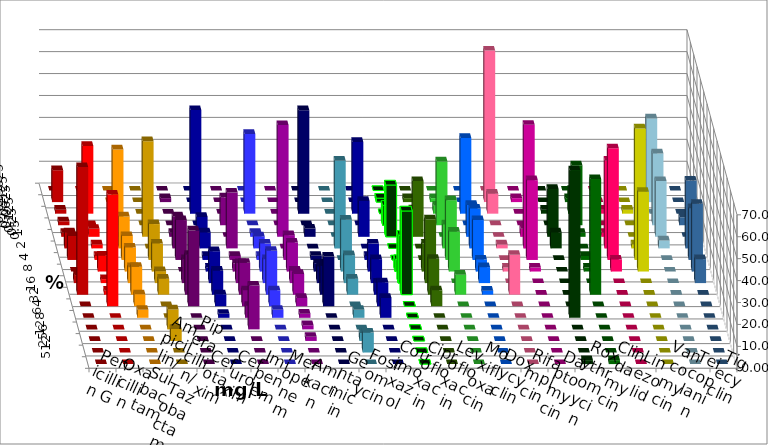
| Category | Penicillin G | Oxacillin | Ampicillin/ Sulbactam | Piperacillin/ Tazobactam | Cefotaxim | Cefuroxim | Imipenem | Meropenem | Amikacin | Gentamicin | Fosfomycin | Cotrimoxazol | Ciprofloxacin | Levofloxacin | Moxifloxacin | Doxycyclin | Rifampicin | Daptomycin | Roxythromycin | Clindamycin | Linezolid | Vancomycin | Teicoplanin | Tigecyclin |
|---|---|---|---|---|---|---|---|---|---|---|---|---|---|---|---|---|---|---|---|---|---|---|---|---|
| 0.015625 | 0 | 0 | 0 | 0 | 0 | 0 | 0 | 0 | 0 | 0 | 0 | 0 | 0 | 0 | 0 | 0 | 0 | 0 | 0 | 0 | 0 | 0 | 0 | 0 |
| 0.03125 | 14.545 | 0 | 0 | 0 | 1.818 | 0 | 0 | 0 | 0 | 0 | 0 | 0 | 1.818 | 1.818 | 1.818 | 0 | 69.091 | 1.818 | 0 | 1.818 | 0 | 0 | 0 | 38.182 |
| 0.0625 | 1.818 | 30.909 | 0 | 0 | 0 | 0 | 47.273 | 36.364 | 0 | 47.17 | 0 | 32.727 | 0 | 0 | 3.636 | 34.545 | 9.091 | 0 | 1.818 | 10.909 | 1.818 | 1.818 | 0 | 0 |
| 0.125 | 1.818 | 0 | 34.545 | 0 | 0 | 12.727 | 0 | 0 | 0 | 0 | 0 | 0 | 9.091 | 7.273 | 29.091 | 0 | 0 | 0 | 0 | 27.273 | 0 | 0 | 3.636 | 32.727 |
| 0.25 | 1.818 | 3.636 | 0 | 43.636 | 1.818 | 0 | 9.091 | 1.818 | 50.943 | 3.774 | 0 | 16.364 | 23.636 | 25.455 | 0 | 14.545 | 0 | 3.636 | 21.818 | 1.818 | 1.818 | 0 | 0 | 25.455 |
| 0.5 | 7.273 | 1.818 | 14.545 | 0 | 14.545 | 25.455 | 7.273 | 5.455 | 0 | 0 | 40 | 0 | 0 | 0 | 10.909 | 18.182 | 1.818 | 56.364 | 7.273 | 0 | 40 | 1.818 | 30.909 | 3.636 |
| 1.0 | 10.909 | 1.818 | 10.909 | 16.364 | 18.182 | 1.818 | 1.818 | 1.818 | 11.321 | 1.887 | 0 | 1.818 | 0 | 0 | 27.273 | 18.182 | 0 | 36.364 | 0 | 1.818 | 50.909 | 60 | 23.636 | 0 |
| 2.0 | 0 | 7.273 | 10.909 | 12.727 | 0 | 3.636 | 1.818 | 12.727 | 13.208 | 3.774 | 23.636 | 12.727 | 5.455 | 12.727 | 18.182 | 5.455 | 1.818 | 1.818 | 0 | 1.818 | 5.455 | 36.364 | 30.909 | 0 |
| 4.0 | 3.636 | 1.818 | 7.273 | 5.455 | 10.909 | 9.091 | 14.545 | 10.909 | 5.66 | 7.547 | 12.727 | 10.909 | 21.818 | 29.091 | 0 | 7.273 | 0 | 0 | 0 | 0 | 0 | 0 | 10.909 | 0 |
| 8.0 | 58.182 | 1.818 | 12.727 | 7.273 | 18.182 | 14.545 | 10.909 | 20 | 9.434 | 13.208 | 7.273 | 5.455 | 38.182 | 16.364 | 9.091 | 1.818 | 18.182 | 0 | 0 | 52.727 | 0 | 0 | 0 | 0 |
| 16.0 | 0 | 50.909 | 5.455 | 0 | 34.545 | 7.273 | 5.455 | 7.273 | 3.774 | 22.642 | 0 | 10.909 | 0 | 7.273 | 0 | 0 | 0 | 0 | 0 | 0 | 0 | 0 | 0 | 0 |
| 32.0 | 0 | 0 | 3.636 | 0 | 0 | 5.455 | 1.818 | 3.636 | 1.887 | 0 | 3.636 | 9.091 | 0 | 0 | 0 | 0 | 0 | 0 | 67.273 | 0 | 0 | 0 | 0 | 0 |
| 64.0 | 0 | 0 | 0 | 9.091 | 0 | 20 | 0 | 0 | 1.887 | 0 | 0 | 0 | 0 | 0 | 0 | 0 | 0 | 0 | 0 | 0 | 0 | 0 | 0 | 0 |
| 128.0 | 0 | 0 | 0 | 5.455 | 0 | 0 | 0 | 0 | 1.887 | 0 | 3.636 | 0 | 0 | 0 | 0 | 0 | 0 | 0 | 0 | 0 | 0 | 0 | 0 | 0 |
| 256.0 | 0 | 0 | 0 | 0 | 0 | 0 | 0 | 0 | 0 | 0 | 9.091 | 0 | 0 | 0 | 0 | 0 | 0 | 0 | 0 | 0 | 0 | 0 | 0 | 0 |
| 512.0 | 0 | 0 | 0 | 0 | 0 | 0 | 0 | 0 | 0 | 0 | 0 | 0 | 0 | 0 | 0 | 0 | 0 | 0 | 1.818 | 1.818 | 0 | 0 | 0 | 0 |